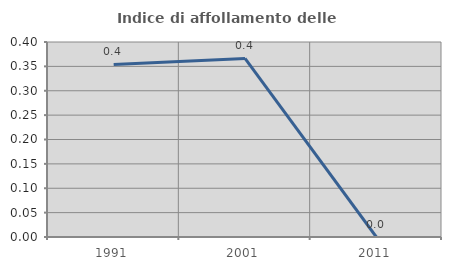
| Category | Indice di affollamento delle abitazioni  |
|---|---|
| 1991.0 | 0.354 |
| 2001.0 | 0.366 |
| 2011.0 | 0 |